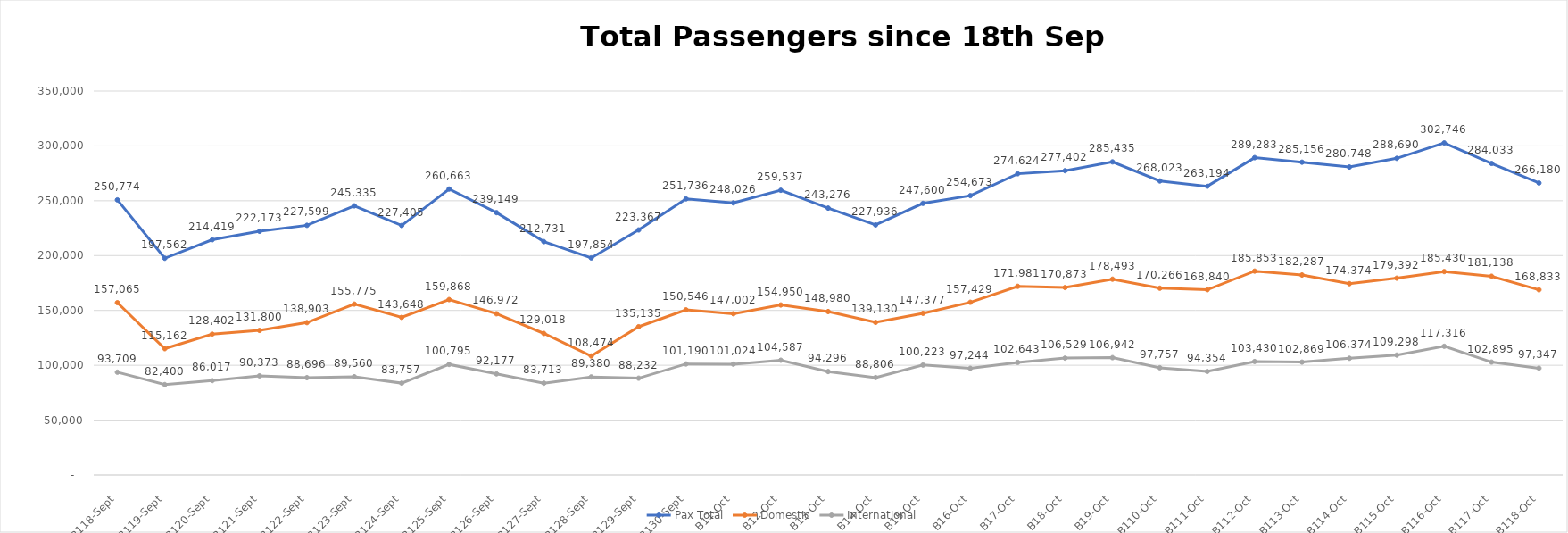
| Category | Pax Total |  Domestic  |  International  |
|---|---|---|---|
| 2022-09-18 | 250774 | 157065 | 93709 |
| 2022-09-19 | 197562 | 115162 | 82400 |
| 2022-09-20 | 214419 | 128402 | 86017 |
| 2022-09-21 | 222173 | 131800 | 90373 |
| 2022-09-22 | 227599 | 138903 | 88696 |
| 2022-09-23 | 245335 | 155775 | 89560 |
| 2022-09-24 | 227405 | 143648 | 83757 |
| 2022-09-25 | 260663 | 159868 | 100795 |
| 2022-09-26 | 239149 | 146972 | 92177 |
| 2022-09-27 | 212731 | 129018 | 83713 |
| 2022-09-28 | 197854 | 108474 | 89380 |
| 2022-09-29 | 223367 | 135135 | 88232 |
| 2022-09-30 | 251736 | 150546 | 101190 |
| 2022-10-01 | 248026 | 147002 | 101024 |
| 2022-10-02 | 259537 | 154950 | 104587 |
| 2022-10-03 | 243276 | 148980 | 94296 |
| 2022-10-04 | 227936 | 139130 | 88806 |
| 2022-10-05 | 247600 | 147377 | 100223 |
| 2022-10-06 | 254673 | 157429 | 97244 |
| 2022-10-07 | 274624 | 171981 | 102643 |
| 2022-10-08 | 277402 | 170873 | 106529 |
| 2022-10-09 | 285435 | 178493 | 106942 |
| 2022-10-10 | 268023 | 170266 | 97757 |
| 2022-10-11 | 263194 | 168840 | 94354 |
| 2022-10-12 | 289283 | 185853 | 103430 |
| 2022-10-13 | 285156 | 182287 | 102869 |
| 2022-10-14 | 280748 | 174374 | 106374 |
| 2022-10-15 | 288690 | 179392 | 109298 |
| 2022-10-16 | 302746 | 185430 | 117316 |
| 2022-10-17 | 284033 | 181138 | 102895 |
| 2022-10-18 | 266180 | 168833 | 97347 |